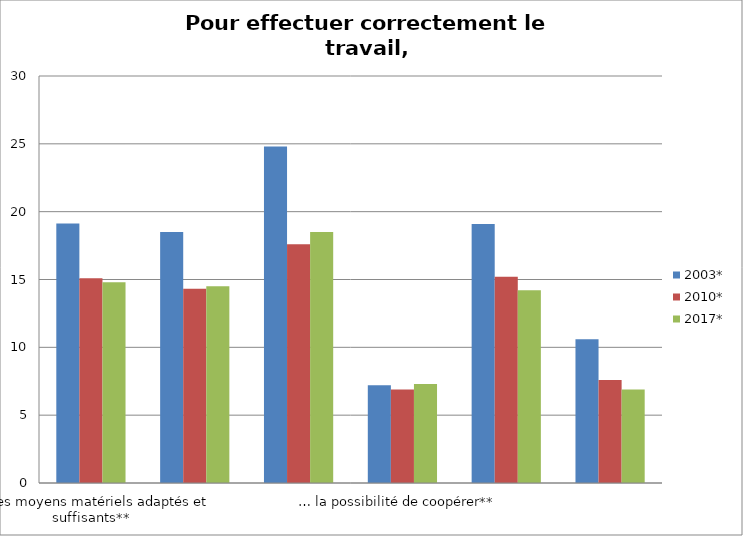
| Category | 2003* | 2010* | 2017* |
|---|---|---|---|
| … des moyens matériels adaptés et suffisants** | 19.12 | 15.1 | 14.8 |
| … des informations claires et suffisantes** | 18.5 | 14.31 | 14.5 |
| … un nombre de collègues ou de collaborateurs suffisants | 24.8 | 17.6 | 18.5 |
| … la possibilité de coopérer**  | 7.2 | 6.9 | 7.3 |
| … une formation suffisante et adaptée** | 19.1 | 15.2 | 14.2 |
| … 3 indicateurs ou plus de travail empêché** | 10.6 | 7.6 | 6.9 |